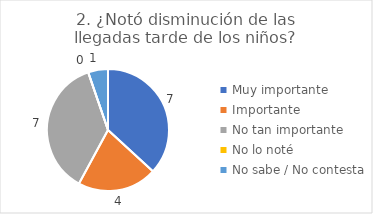
| Category | 2. ¿Notó disminución de las llegadas tarde de los niños? |
|---|---|
| Muy importante  | 0.368 |
| Importante  | 0.211 |
| No tan importante  | 0.368 |
| No lo noté  | 0 |
| No sabe / No contesta | 0.053 |